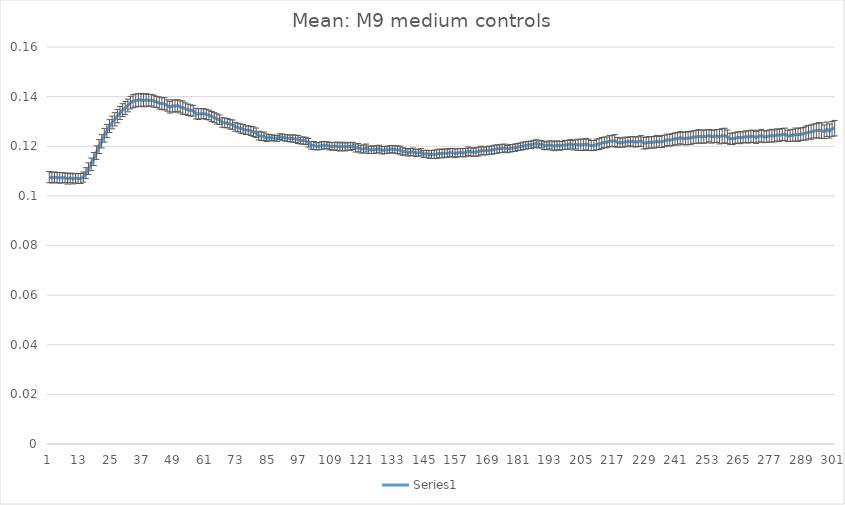
| Category | Series 0 |
|---|---|
| 0 | 0.108 |
| 1 | 0.107 |
| 2 | 0.108 |
| 3 | 0.107 |
| 4 | 0.107 |
| 5 | 0.107 |
| 6 | 0.107 |
| 7 | 0.107 |
| 8 | 0.107 |
| 9 | 0.107 |
| 10 | 0.107 |
| 11 | 0.107 |
| 12 | 0.107 |
| 13 | 0.108 |
| 14 | 0.109 |
| 15 | 0.111 |
| 16 | 0.113 |
| 17 | 0.115 |
| 18 | 0.117 |
| 19 | 0.12 |
| 20 | 0.122 |
| 21 | 0.124 |
| 22 | 0.126 |
| 23 | 0.128 |
| 24 | 0.13 |
| 25 | 0.131 |
| 26 | 0.132 |
| 27 | 0.133 |
| 28 | 0.135 |
| 29 | 0.135 |
| 30 | 0.136 |
| 31 | 0.138 |
| 32 | 0.138 |
| 33 | 0.138 |
| 34 | 0.139 |
| 35 | 0.139 |
| 36 | 0.138 |
| 37 | 0.139 |
| 38 | 0.138 |
| 39 | 0.139 |
| 40 | 0.138 |
| 41 | 0.138 |
| 42 | 0.137 |
| 43 | 0.137 |
| 44 | 0.137 |
| 45 | 0.136 |
| 46 | 0.136 |
| 47 | 0.136 |
| 48 | 0.136 |
| 49 | 0.136 |
| 50 | 0.136 |
| 51 | 0.136 |
| 52 | 0.135 |
| 53 | 0.135 |
| 54 | 0.134 |
| 55 | 0.134 |
| 56 | 0.133 |
| 57 | 0.133 |
| 58 | 0.133 |
| 59 | 0.133 |
| 60 | 0.133 |
| 61 | 0.133 |
| 62 | 0.132 |
| 63 | 0.132 |
| 64 | 0.131 |
| 65 | 0.131 |
| 66 | 0.13 |
| 67 | 0.129 |
| 68 | 0.129 |
| 69 | 0.129 |
| 70 | 0.129 |
| 71 | 0.128 |
| 72 | 0.128 |
| 73 | 0.127 |
| 74 | 0.127 |
| 75 | 0.126 |
| 76 | 0.127 |
| 77 | 0.126 |
| 78 | 0.126 |
| 79 | 0.125 |
| 80 | 0.124 |
| 81 | 0.124 |
| 82 | 0.124 |
| 83 | 0.123 |
| 84 | 0.123 |
| 85 | 0.123 |
| 86 | 0.123 |
| 87 | 0.123 |
| 88 | 0.124 |
| 89 | 0.124 |
| 90 | 0.123 |
| 91 | 0.123 |
| 92 | 0.123 |
| 93 | 0.123 |
| 94 | 0.123 |
| 95 | 0.123 |
| 96 | 0.122 |
| 97 | 0.122 |
| 98 | 0.122 |
| 99 | 0.121 |
| 100 | 0.12 |
| 101 | 0.12 |
| 102 | 0.12 |
| 103 | 0.12 |
| 104 | 0.12 |
| 105 | 0.12 |
| 106 | 0.12 |
| 107 | 0.12 |
| 108 | 0.12 |
| 109 | 0.12 |
| 110 | 0.12 |
| 111 | 0.12 |
| 112 | 0.12 |
| 113 | 0.12 |
| 114 | 0.12 |
| 115 | 0.12 |
| 116 | 0.12 |
| 117 | 0.119 |
| 118 | 0.119 |
| 119 | 0.119 |
| 120 | 0.119 |
| 121 | 0.119 |
| 122 | 0.119 |
| 123 | 0.119 |
| 124 | 0.119 |
| 125 | 0.119 |
| 126 | 0.119 |
| 127 | 0.118 |
| 128 | 0.118 |
| 129 | 0.119 |
| 130 | 0.119 |
| 131 | 0.119 |
| 132 | 0.119 |
| 133 | 0.119 |
| 134 | 0.118 |
| 135 | 0.118 |
| 136 | 0.118 |
| 137 | 0.117 |
| 138 | 0.118 |
| 139 | 0.118 |
| 140 | 0.117 |
| 141 | 0.117 |
| 142 | 0.118 |
| 143 | 0.117 |
| 144 | 0.117 |
| 145 | 0.117 |
| 146 | 0.117 |
| 147 | 0.117 |
| 148 | 0.117 |
| 149 | 0.117 |
| 150 | 0.117 |
| 151 | 0.117 |
| 152 | 0.117 |
| 153 | 0.117 |
| 154 | 0.117 |
| 155 | 0.117 |
| 156 | 0.117 |
| 157 | 0.117 |
| 158 | 0.117 |
| 159 | 0.117 |
| 160 | 0.118 |
| 161 | 0.118 |
| 162 | 0.118 |
| 163 | 0.118 |
| 164 | 0.118 |
| 165 | 0.118 |
| 166 | 0.118 |
| 167 | 0.118 |
| 168 | 0.118 |
| 169 | 0.118 |
| 170 | 0.119 |
| 171 | 0.119 |
| 172 | 0.119 |
| 173 | 0.119 |
| 174 | 0.119 |
| 175 | 0.119 |
| 176 | 0.119 |
| 177 | 0.119 |
| 178 | 0.119 |
| 179 | 0.12 |
| 180 | 0.12 |
| 181 | 0.12 |
| 182 | 0.12 |
| 183 | 0.121 |
| 184 | 0.121 |
| 185 | 0.121 |
| 186 | 0.121 |
| 187 | 0.121 |
| 188 | 0.121 |
| 189 | 0.12 |
| 190 | 0.12 |
| 191 | 0.121 |
| 192 | 0.12 |
| 193 | 0.12 |
| 194 | 0.12 |
| 195 | 0.12 |
| 196 | 0.12 |
| 197 | 0.121 |
| 198 | 0.121 |
| 199 | 0.121 |
| 200 | 0.12 |
| 201 | 0.121 |
| 202 | 0.121 |
| 203 | 0.121 |
| 204 | 0.121 |
| 205 | 0.121 |
| 206 | 0.121 |
| 207 | 0.12 |
| 208 | 0.12 |
| 209 | 0.121 |
| 210 | 0.121 |
| 211 | 0.121 |
| 212 | 0.122 |
| 213 | 0.122 |
| 214 | 0.122 |
| 215 | 0.122 |
| 216 | 0.122 |
| 217 | 0.122 |
| 218 | 0.121 |
| 219 | 0.121 |
| 220 | 0.122 |
| 221 | 0.122 |
| 222 | 0.122 |
| 223 | 0.122 |
| 224 | 0.122 |
| 225 | 0.122 |
| 226 | 0.122 |
| 227 | 0.121 |
| 228 | 0.121 |
| 229 | 0.122 |
| 230 | 0.122 |
| 231 | 0.122 |
| 232 | 0.122 |
| 233 | 0.122 |
| 234 | 0.122 |
| 235 | 0.122 |
| 236 | 0.123 |
| 237 | 0.122 |
| 238 | 0.123 |
| 239 | 0.123 |
| 240 | 0.123 |
| 241 | 0.123 |
| 242 | 0.123 |
| 243 | 0.123 |
| 244 | 0.123 |
| 245 | 0.123 |
| 246 | 0.124 |
| 247 | 0.124 |
| 248 | 0.124 |
| 249 | 0.124 |
| 250 | 0.124 |
| 251 | 0.124 |
| 252 | 0.124 |
| 253 | 0.124 |
| 254 | 0.124 |
| 255 | 0.124 |
| 256 | 0.124 |
| 257 | 0.124 |
| 258 | 0.124 |
| 259 | 0.124 |
| 260 | 0.123 |
| 261 | 0.123 |
| 262 | 0.123 |
| 263 | 0.124 |
| 264 | 0.123 |
| 265 | 0.124 |
| 266 | 0.124 |
| 267 | 0.124 |
| 268 | 0.124 |
| 269 | 0.124 |
| 270 | 0.124 |
| 271 | 0.124 |
| 272 | 0.124 |
| 273 | 0.124 |
| 274 | 0.124 |
| 275 | 0.124 |
| 276 | 0.124 |
| 277 | 0.124 |
| 278 | 0.125 |
| 279 | 0.124 |
| 280 | 0.125 |
| 281 | 0.125 |
| 282 | 0.124 |
| 283 | 0.124 |
| 284 | 0.124 |
| 285 | 0.125 |
| 286 | 0.125 |
| 287 | 0.125 |
| 288 | 0.125 |
| 289 | 0.125 |
| 290 | 0.126 |
| 291 | 0.126 |
| 292 | 0.126 |
| 293 | 0.126 |
| 294 | 0.126 |
| 295 | 0.126 |
| 296 | 0.126 |
| 297 | 0.127 |
| 298 | 0.126 |
| 299 | 0.127 |
| 300 | 0.127 |